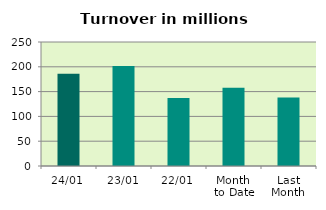
| Category | Series 0 |
|---|---|
| 24/01 | 185.953 |
| 23/01 | 201.841 |
| 22/01 | 137.011 |
| Month 
to Date | 157.588 |
| Last
Month | 138.201 |